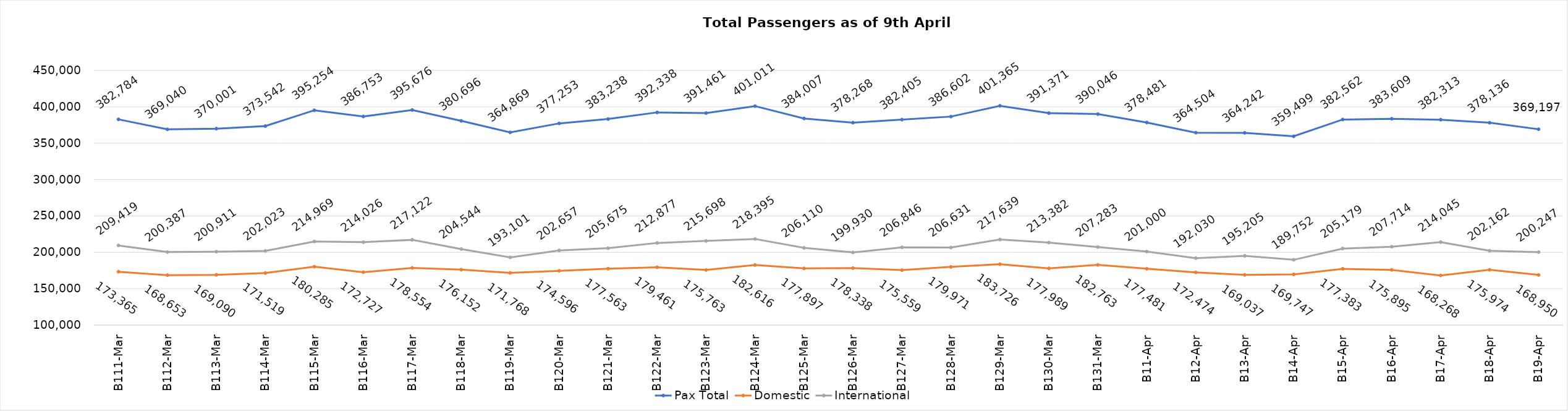
| Category | Pax Total | Domestic | International |
|---|---|---|---|
| 2024-03-11 | 382784 | 173365 | 209419 |
| 2024-03-12 | 369040 | 168653 | 200387 |
| 2024-03-13 | 370001 | 169090 | 200911 |
| 2024-03-14 | 373542 | 171519 | 202023 |
| 2024-03-15 | 395254 | 180285 | 214969 |
| 2024-03-16 | 386753 | 172727 | 214026 |
| 2024-03-17 | 395676 | 178554 | 217122 |
| 2024-03-18 | 380696 | 176152 | 204544 |
| 2024-03-19 | 364869 | 171768 | 193101 |
| 2024-03-20 | 377253 | 174596 | 202657 |
| 2024-03-21 | 383238 | 177563 | 205675 |
| 2024-03-22 | 392338 | 179461 | 212877 |
| 2024-03-23 | 391461 | 175763 | 215698 |
| 2024-03-24 | 401011 | 182616 | 218395 |
| 2024-03-25 | 384007 | 177897 | 206110 |
| 2024-03-26 | 378268 | 178338 | 199930 |
| 2024-03-27 | 382405 | 175559 | 206846 |
| 2024-03-28 | 386602 | 179971 | 206631 |
| 2024-03-29 | 401365 | 183726 | 217639 |
| 2024-03-30 | 391371 | 177989 | 213382 |
| 2024-03-31 | 390046 | 182763 | 207283 |
| 2024-04-01 | 378481 | 177481 | 201000 |
| 2024-04-02 | 364504 | 172474 | 192030 |
| 2024-04-03 | 364242 | 169037 | 195205 |
| 2024-04-04 | 359499 | 169747 | 189752 |
| 2024-04-05 | 382562 | 177383 | 205179 |
| 2024-04-06 | 383609 | 175895 | 207714 |
| 2024-04-07 | 382313 | 168268 | 214045 |
| 2024-04-08 | 378136 | 175974 | 202162 |
| 2024-04-09 | 369197 | 168950 | 200247 |